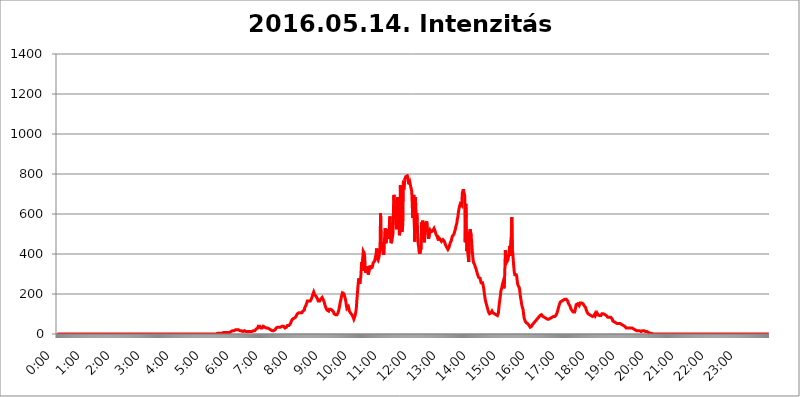
| Category | 2016.05.14. Intenzitás [W/m^2] |
|---|---|
| 0.0 | 0 |
| 0.0006944444444444445 | 0 |
| 0.001388888888888889 | 0 |
| 0.0020833333333333333 | 0 |
| 0.002777777777777778 | 0 |
| 0.003472222222222222 | 0 |
| 0.004166666666666667 | 0 |
| 0.004861111111111111 | 0 |
| 0.005555555555555556 | 0 |
| 0.0062499999999999995 | 0 |
| 0.006944444444444444 | 0 |
| 0.007638888888888889 | 0 |
| 0.008333333333333333 | 0 |
| 0.009027777777777779 | 0 |
| 0.009722222222222222 | 0 |
| 0.010416666666666666 | 0 |
| 0.011111111111111112 | 0 |
| 0.011805555555555555 | 0 |
| 0.012499999999999999 | 0 |
| 0.013194444444444444 | 0 |
| 0.013888888888888888 | 0 |
| 0.014583333333333332 | 0 |
| 0.015277777777777777 | 0 |
| 0.015972222222222224 | 0 |
| 0.016666666666666666 | 0 |
| 0.017361111111111112 | 0 |
| 0.018055555555555557 | 0 |
| 0.01875 | 0 |
| 0.019444444444444445 | 0 |
| 0.02013888888888889 | 0 |
| 0.020833333333333332 | 0 |
| 0.02152777777777778 | 0 |
| 0.022222222222222223 | 0 |
| 0.02291666666666667 | 0 |
| 0.02361111111111111 | 0 |
| 0.024305555555555556 | 0 |
| 0.024999999999999998 | 0 |
| 0.025694444444444447 | 0 |
| 0.02638888888888889 | 0 |
| 0.027083333333333334 | 0 |
| 0.027777777777777776 | 0 |
| 0.02847222222222222 | 0 |
| 0.029166666666666664 | 0 |
| 0.029861111111111113 | 0 |
| 0.030555555555555555 | 0 |
| 0.03125 | 0 |
| 0.03194444444444445 | 0 |
| 0.03263888888888889 | 0 |
| 0.03333333333333333 | 0 |
| 0.034027777777777775 | 0 |
| 0.034722222222222224 | 0 |
| 0.035416666666666666 | 0 |
| 0.036111111111111115 | 0 |
| 0.03680555555555556 | 0 |
| 0.0375 | 0 |
| 0.03819444444444444 | 0 |
| 0.03888888888888889 | 0 |
| 0.03958333333333333 | 0 |
| 0.04027777777777778 | 0 |
| 0.04097222222222222 | 0 |
| 0.041666666666666664 | 0 |
| 0.042361111111111106 | 0 |
| 0.04305555555555556 | 0 |
| 0.043750000000000004 | 0 |
| 0.044444444444444446 | 0 |
| 0.04513888888888889 | 0 |
| 0.04583333333333334 | 0 |
| 0.04652777777777778 | 0 |
| 0.04722222222222222 | 0 |
| 0.04791666666666666 | 0 |
| 0.04861111111111111 | 0 |
| 0.049305555555555554 | 0 |
| 0.049999999999999996 | 0 |
| 0.05069444444444445 | 0 |
| 0.051388888888888894 | 0 |
| 0.052083333333333336 | 0 |
| 0.05277777777777778 | 0 |
| 0.05347222222222222 | 0 |
| 0.05416666666666667 | 0 |
| 0.05486111111111111 | 0 |
| 0.05555555555555555 | 0 |
| 0.05625 | 0 |
| 0.05694444444444444 | 0 |
| 0.057638888888888885 | 0 |
| 0.05833333333333333 | 0 |
| 0.05902777777777778 | 0 |
| 0.059722222222222225 | 0 |
| 0.06041666666666667 | 0 |
| 0.061111111111111116 | 0 |
| 0.06180555555555556 | 0 |
| 0.0625 | 0 |
| 0.06319444444444444 | 0 |
| 0.06388888888888888 | 0 |
| 0.06458333333333334 | 0 |
| 0.06527777777777778 | 0 |
| 0.06597222222222222 | 0 |
| 0.06666666666666667 | 0 |
| 0.06736111111111111 | 0 |
| 0.06805555555555555 | 0 |
| 0.06874999999999999 | 0 |
| 0.06944444444444443 | 0 |
| 0.07013888888888889 | 0 |
| 0.07083333333333333 | 0 |
| 0.07152777777777779 | 0 |
| 0.07222222222222223 | 0 |
| 0.07291666666666667 | 0 |
| 0.07361111111111111 | 0 |
| 0.07430555555555556 | 0 |
| 0.075 | 0 |
| 0.07569444444444444 | 0 |
| 0.0763888888888889 | 0 |
| 0.07708333333333334 | 0 |
| 0.07777777777777778 | 0 |
| 0.07847222222222222 | 0 |
| 0.07916666666666666 | 0 |
| 0.0798611111111111 | 0 |
| 0.08055555555555556 | 0 |
| 0.08125 | 0 |
| 0.08194444444444444 | 0 |
| 0.08263888888888889 | 0 |
| 0.08333333333333333 | 0 |
| 0.08402777777777777 | 0 |
| 0.08472222222222221 | 0 |
| 0.08541666666666665 | 0 |
| 0.08611111111111112 | 0 |
| 0.08680555555555557 | 0 |
| 0.08750000000000001 | 0 |
| 0.08819444444444445 | 0 |
| 0.08888888888888889 | 0 |
| 0.08958333333333333 | 0 |
| 0.09027777777777778 | 0 |
| 0.09097222222222222 | 0 |
| 0.09166666666666667 | 0 |
| 0.09236111111111112 | 0 |
| 0.09305555555555556 | 0 |
| 0.09375 | 0 |
| 0.09444444444444444 | 0 |
| 0.09513888888888888 | 0 |
| 0.09583333333333333 | 0 |
| 0.09652777777777777 | 0 |
| 0.09722222222222222 | 0 |
| 0.09791666666666667 | 0 |
| 0.09861111111111111 | 0 |
| 0.09930555555555555 | 0 |
| 0.09999999999999999 | 0 |
| 0.10069444444444443 | 0 |
| 0.1013888888888889 | 0 |
| 0.10208333333333335 | 0 |
| 0.10277777777777779 | 0 |
| 0.10347222222222223 | 0 |
| 0.10416666666666667 | 0 |
| 0.10486111111111111 | 0 |
| 0.10555555555555556 | 0 |
| 0.10625 | 0 |
| 0.10694444444444444 | 0 |
| 0.1076388888888889 | 0 |
| 0.10833333333333334 | 0 |
| 0.10902777777777778 | 0 |
| 0.10972222222222222 | 0 |
| 0.1111111111111111 | 0 |
| 0.11180555555555556 | 0 |
| 0.11180555555555556 | 0 |
| 0.1125 | 0 |
| 0.11319444444444444 | 0 |
| 0.11388888888888889 | 0 |
| 0.11458333333333333 | 0 |
| 0.11527777777777777 | 0 |
| 0.11597222222222221 | 0 |
| 0.11666666666666665 | 0 |
| 0.1173611111111111 | 0 |
| 0.11805555555555557 | 0 |
| 0.11944444444444445 | 0 |
| 0.12013888888888889 | 0 |
| 0.12083333333333333 | 0 |
| 0.12152777777777778 | 0 |
| 0.12222222222222223 | 0 |
| 0.12291666666666667 | 0 |
| 0.12291666666666667 | 0 |
| 0.12361111111111112 | 0 |
| 0.12430555555555556 | 0 |
| 0.125 | 0 |
| 0.12569444444444444 | 0 |
| 0.12638888888888888 | 0 |
| 0.12708333333333333 | 0 |
| 0.16875 | 0 |
| 0.12847222222222224 | 0 |
| 0.12916666666666668 | 0 |
| 0.12986111111111112 | 0 |
| 0.13055555555555556 | 0 |
| 0.13125 | 0 |
| 0.13194444444444445 | 0 |
| 0.1326388888888889 | 0 |
| 0.13333333333333333 | 0 |
| 0.13402777777777777 | 0 |
| 0.13402777777777777 | 0 |
| 0.13472222222222222 | 0 |
| 0.13541666666666666 | 0 |
| 0.1361111111111111 | 0 |
| 0.13749999999999998 | 0 |
| 0.13819444444444443 | 0 |
| 0.1388888888888889 | 0 |
| 0.13958333333333334 | 0 |
| 0.14027777777777778 | 0 |
| 0.14097222222222222 | 0 |
| 0.14166666666666666 | 0 |
| 0.1423611111111111 | 0 |
| 0.14305555555555557 | 0 |
| 0.14375000000000002 | 0 |
| 0.14444444444444446 | 0 |
| 0.1451388888888889 | 0 |
| 0.1451388888888889 | 0 |
| 0.14652777777777778 | 0 |
| 0.14722222222222223 | 0 |
| 0.14791666666666667 | 0 |
| 0.1486111111111111 | 0 |
| 0.14930555555555555 | 0 |
| 0.15 | 0 |
| 0.15069444444444444 | 0 |
| 0.15138888888888888 | 0 |
| 0.15208333333333332 | 0 |
| 0.15277777777777776 | 0 |
| 0.15347222222222223 | 0 |
| 0.15416666666666667 | 0 |
| 0.15486111111111112 | 0 |
| 0.15555555555555556 | 0 |
| 0.15625 | 0 |
| 0.15694444444444444 | 0 |
| 0.15763888888888888 | 0 |
| 0.15833333333333333 | 0 |
| 0.15902777777777777 | 0 |
| 0.15972222222222224 | 0 |
| 0.16041666666666668 | 0 |
| 0.16111111111111112 | 0 |
| 0.16180555555555556 | 0 |
| 0.1625 | 0 |
| 0.16319444444444445 | 0 |
| 0.1638888888888889 | 0 |
| 0.16458333333333333 | 0 |
| 0.16527777777777777 | 0 |
| 0.16597222222222222 | 0 |
| 0.16666666666666666 | 0 |
| 0.1673611111111111 | 0 |
| 0.16805555555555554 | 0 |
| 0.16874999999999998 | 0 |
| 0.16944444444444443 | 0 |
| 0.17013888888888887 | 0 |
| 0.1708333333333333 | 0 |
| 0.17152777777777775 | 0 |
| 0.17222222222222225 | 0 |
| 0.1729166666666667 | 0 |
| 0.17361111111111113 | 0 |
| 0.17430555555555557 | 0 |
| 0.17500000000000002 | 0 |
| 0.17569444444444446 | 0 |
| 0.1763888888888889 | 0 |
| 0.17708333333333334 | 0 |
| 0.17777777777777778 | 0 |
| 0.17847222222222223 | 0 |
| 0.17916666666666667 | 0 |
| 0.1798611111111111 | 0 |
| 0.18055555555555555 | 0 |
| 0.18125 | 0 |
| 0.18194444444444444 | 0 |
| 0.1826388888888889 | 0 |
| 0.18333333333333335 | 0 |
| 0.1840277777777778 | 0 |
| 0.18472222222222223 | 0 |
| 0.18541666666666667 | 0 |
| 0.18611111111111112 | 0 |
| 0.18680555555555556 | 0 |
| 0.1875 | 0 |
| 0.18819444444444444 | 0 |
| 0.18888888888888888 | 0 |
| 0.18958333333333333 | 0 |
| 0.19027777777777777 | 0 |
| 0.1909722222222222 | 0 |
| 0.19166666666666665 | 0 |
| 0.19236111111111112 | 0 |
| 0.19305555555555554 | 0 |
| 0.19375 | 0 |
| 0.19444444444444445 | 0 |
| 0.1951388888888889 | 0 |
| 0.19583333333333333 | 0 |
| 0.19652777777777777 | 0 |
| 0.19722222222222222 | 0 |
| 0.19791666666666666 | 0 |
| 0.1986111111111111 | 0 |
| 0.19930555555555554 | 0 |
| 0.19999999999999998 | 0 |
| 0.20069444444444443 | 0 |
| 0.20138888888888887 | 0 |
| 0.2020833333333333 | 0 |
| 0.2027777777777778 | 0 |
| 0.2034722222222222 | 0 |
| 0.2041666666666667 | 0 |
| 0.20486111111111113 | 0 |
| 0.20555555555555557 | 0 |
| 0.20625000000000002 | 0 |
| 0.20694444444444446 | 0 |
| 0.2076388888888889 | 0 |
| 0.20833333333333334 | 0 |
| 0.20902777777777778 | 0 |
| 0.20972222222222223 | 0 |
| 0.21041666666666667 | 0 |
| 0.2111111111111111 | 0 |
| 0.21180555555555555 | 0 |
| 0.2125 | 0 |
| 0.21319444444444444 | 0 |
| 0.2138888888888889 | 0 |
| 0.21458333333333335 | 0 |
| 0.2152777777777778 | 0 |
| 0.21597222222222223 | 0 |
| 0.21666666666666667 | 0 |
| 0.21736111111111112 | 0 |
| 0.21805555555555556 | 0 |
| 0.21875 | 0 |
| 0.21944444444444444 | 0 |
| 0.22013888888888888 | 0 |
| 0.22083333333333333 | 0 |
| 0.22152777777777777 | 0 |
| 0.2222222222222222 | 0 |
| 0.22291666666666665 | 0 |
| 0.2236111111111111 | 0 |
| 0.22430555555555556 | 0 |
| 0.225 | 3.525 |
| 0.22569444444444445 | 3.525 |
| 0.2263888888888889 | 3.525 |
| 0.22708333333333333 | 3.525 |
| 0.22777777777777777 | 3.525 |
| 0.22847222222222222 | 3.525 |
| 0.22916666666666666 | 3.525 |
| 0.2298611111111111 | 3.525 |
| 0.23055555555555554 | 3.525 |
| 0.23124999999999998 | 3.525 |
| 0.23194444444444443 | 3.525 |
| 0.23263888888888887 | 7.887 |
| 0.2333333333333333 | 7.887 |
| 0.2340277777777778 | 7.887 |
| 0.2347222222222222 | 7.887 |
| 0.2354166666666667 | 7.887 |
| 0.23611111111111113 | 7.887 |
| 0.23680555555555557 | 7.887 |
| 0.23750000000000002 | 7.887 |
| 0.23819444444444446 | 7.887 |
| 0.2388888888888889 | 7.887 |
| 0.23958333333333334 | 7.887 |
| 0.24027777777777778 | 7.887 |
| 0.24097222222222223 | 7.887 |
| 0.24166666666666667 | 7.887 |
| 0.2423611111111111 | 7.887 |
| 0.24305555555555555 | 12.257 |
| 0.24375 | 12.257 |
| 0.24444444444444446 | 12.257 |
| 0.24513888888888888 | 12.257 |
| 0.24583333333333335 | 16.636 |
| 0.2465277777777778 | 16.636 |
| 0.24722222222222223 | 16.636 |
| 0.24791666666666667 | 16.636 |
| 0.24861111111111112 | 16.636 |
| 0.24930555555555556 | 16.636 |
| 0.25 | 21.024 |
| 0.25069444444444444 | 21.024 |
| 0.2513888888888889 | 21.024 |
| 0.2520833333333333 | 21.024 |
| 0.25277777777777777 | 21.024 |
| 0.2534722222222222 | 21.024 |
| 0.25416666666666665 | 21.024 |
| 0.2548611111111111 | 16.636 |
| 0.2555555555555556 | 16.636 |
| 0.25625000000000003 | 16.636 |
| 0.2569444444444445 | 16.636 |
| 0.2576388888888889 | 16.636 |
| 0.25833333333333336 | 16.636 |
| 0.2590277777777778 | 12.257 |
| 0.25972222222222224 | 12.257 |
| 0.2604166666666667 | 12.257 |
| 0.2611111111111111 | 12.257 |
| 0.26180555555555557 | 16.636 |
| 0.2625 | 16.636 |
| 0.26319444444444445 | 12.257 |
| 0.2638888888888889 | 12.257 |
| 0.26458333333333334 | 12.257 |
| 0.2652777777777778 | 12.257 |
| 0.2659722222222222 | 12.257 |
| 0.26666666666666666 | 12.257 |
| 0.2673611111111111 | 12.257 |
| 0.26805555555555555 | 12.257 |
| 0.26875 | 12.257 |
| 0.26944444444444443 | 12.257 |
| 0.2701388888888889 | 12.257 |
| 0.2708333333333333 | 12.257 |
| 0.27152777777777776 | 16.636 |
| 0.2722222222222222 | 12.257 |
| 0.27291666666666664 | 12.257 |
| 0.2736111111111111 | 16.636 |
| 0.2743055555555555 | 16.636 |
| 0.27499999999999997 | 16.636 |
| 0.27569444444444446 | 16.636 |
| 0.27638888888888885 | 16.636 |
| 0.27708333333333335 | 16.636 |
| 0.2777777777777778 | 21.024 |
| 0.27847222222222223 | 21.024 |
| 0.2791666666666667 | 25.419 |
| 0.2798611111111111 | 29.823 |
| 0.28055555555555556 | 29.823 |
| 0.28125 | 29.823 |
| 0.28194444444444444 | 38.653 |
| 0.2826388888888889 | 43.079 |
| 0.2833333333333333 | 43.079 |
| 0.28402777777777777 | 38.653 |
| 0.2847222222222222 | 38.653 |
| 0.28541666666666665 | 29.823 |
| 0.28611111111111115 | 29.823 |
| 0.28680555555555554 | 29.823 |
| 0.28750000000000003 | 29.823 |
| 0.2881944444444445 | 34.234 |
| 0.2888888888888889 | 38.653 |
| 0.28958333333333336 | 38.653 |
| 0.2902777777777778 | 38.653 |
| 0.29097222222222224 | 34.234 |
| 0.2916666666666667 | 29.823 |
| 0.2923611111111111 | 29.823 |
| 0.29305555555555557 | 29.823 |
| 0.29375 | 34.234 |
| 0.29444444444444445 | 29.823 |
| 0.2951388888888889 | 29.823 |
| 0.29583333333333334 | 25.419 |
| 0.2965277777777778 | 25.419 |
| 0.2972222222222222 | 25.419 |
| 0.29791666666666666 | 25.419 |
| 0.2986111111111111 | 21.024 |
| 0.29930555555555555 | 21.024 |
| 0.3 | 21.024 |
| 0.30069444444444443 | 21.024 |
| 0.3013888888888889 | 16.636 |
| 0.3020833333333333 | 16.636 |
| 0.30277777777777776 | 16.636 |
| 0.3034722222222222 | 16.636 |
| 0.30416666666666664 | 16.636 |
| 0.3048611111111111 | 21.024 |
| 0.3055555555555555 | 21.024 |
| 0.30624999999999997 | 25.419 |
| 0.3069444444444444 | 29.823 |
| 0.3076388888888889 | 29.823 |
| 0.30833333333333335 | 29.823 |
| 0.3090277777777778 | 34.234 |
| 0.30972222222222223 | 34.234 |
| 0.3104166666666667 | 34.234 |
| 0.3111111111111111 | 34.234 |
| 0.31180555555555556 | 29.823 |
| 0.3125 | 29.823 |
| 0.31319444444444444 | 34.234 |
| 0.3138888888888889 | 34.234 |
| 0.3145833333333333 | 34.234 |
| 0.31527777777777777 | 38.653 |
| 0.3159722222222222 | 34.234 |
| 0.31666666666666665 | 38.653 |
| 0.31736111111111115 | 38.653 |
| 0.31805555555555554 | 38.653 |
| 0.31875000000000003 | 34.234 |
| 0.3194444444444445 | 29.823 |
| 0.3201388888888889 | 29.823 |
| 0.32083333333333336 | 34.234 |
| 0.3215277777777778 | 34.234 |
| 0.32222222222222224 | 38.653 |
| 0.3229166666666667 | 43.079 |
| 0.3236111111111111 | 43.079 |
| 0.32430555555555557 | 43.079 |
| 0.325 | 43.079 |
| 0.32569444444444445 | 47.511 |
| 0.3263888888888889 | 47.511 |
| 0.32708333333333334 | 51.951 |
| 0.3277777777777778 | 56.398 |
| 0.3284722222222222 | 65.31 |
| 0.32916666666666666 | 69.775 |
| 0.3298611111111111 | 74.246 |
| 0.33055555555555555 | 78.722 |
| 0.33125 | 78.722 |
| 0.33194444444444443 | 78.722 |
| 0.3326388888888889 | 83.205 |
| 0.3333333333333333 | 83.205 |
| 0.3340277777777778 | 83.205 |
| 0.3347222222222222 | 87.692 |
| 0.3354166666666667 | 92.184 |
| 0.3361111111111111 | 96.682 |
| 0.3368055555555556 | 101.184 |
| 0.33749999999999997 | 101.184 |
| 0.33819444444444446 | 105.69 |
| 0.33888888888888885 | 105.69 |
| 0.33958333333333335 | 110.201 |
| 0.34027777777777773 | 110.201 |
| 0.34097222222222223 | 105.69 |
| 0.3416666666666666 | 105.69 |
| 0.3423611111111111 | 105.69 |
| 0.3430555555555555 | 105.69 |
| 0.34375 | 110.201 |
| 0.3444444444444445 | 114.716 |
| 0.3451388888888889 | 114.716 |
| 0.3458333333333334 | 119.235 |
| 0.34652777777777777 | 119.235 |
| 0.34722222222222227 | 132.814 |
| 0.34791666666666665 | 132.814 |
| 0.34861111111111115 | 141.884 |
| 0.34930555555555554 | 146.423 |
| 0.35000000000000003 | 155.509 |
| 0.3506944444444444 | 164.605 |
| 0.3513888888888889 | 164.605 |
| 0.3520833333333333 | 164.605 |
| 0.3527777777777778 | 164.605 |
| 0.3534722222222222 | 164.605 |
| 0.3541666666666667 | 164.605 |
| 0.3548611111111111 | 164.605 |
| 0.35555555555555557 | 164.605 |
| 0.35625 | 173.709 |
| 0.35694444444444445 | 178.264 |
| 0.3576388888888889 | 187.378 |
| 0.35833333333333334 | 196.497 |
| 0.3590277777777778 | 201.058 |
| 0.3597222222222222 | 210.182 |
| 0.36041666666666666 | 210.182 |
| 0.3611111111111111 | 196.497 |
| 0.36180555555555555 | 196.497 |
| 0.3625 | 191.937 |
| 0.36319444444444443 | 187.378 |
| 0.3638888888888889 | 187.378 |
| 0.3645833333333333 | 182.82 |
| 0.3652777777777778 | 173.709 |
| 0.3659722222222222 | 164.605 |
| 0.3666666666666667 | 160.056 |
| 0.3673611111111111 | 160.056 |
| 0.3680555555555556 | 164.605 |
| 0.36874999999999997 | 169.156 |
| 0.36944444444444446 | 173.709 |
| 0.37013888888888885 | 178.264 |
| 0.37083333333333335 | 178.264 |
| 0.37152777777777773 | 182.82 |
| 0.37222222222222223 | 178.264 |
| 0.3729166666666666 | 173.709 |
| 0.3736111111111111 | 169.156 |
| 0.3743055555555555 | 160.056 |
| 0.375 | 150.964 |
| 0.3756944444444445 | 141.884 |
| 0.3763888888888889 | 137.347 |
| 0.3770833333333334 | 128.284 |
| 0.37777777777777777 | 123.758 |
| 0.37847222222222227 | 119.235 |
| 0.37916666666666665 | 119.235 |
| 0.37986111111111115 | 114.716 |
| 0.38055555555555554 | 114.716 |
| 0.38125000000000003 | 123.758 |
| 0.3819444444444444 | 128.284 |
| 0.3826388888888889 | 128.284 |
| 0.3833333333333333 | 123.758 |
| 0.3840277777777778 | 119.235 |
| 0.3847222222222222 | 119.235 |
| 0.3854166666666667 | 119.235 |
| 0.3861111111111111 | 119.235 |
| 0.38680555555555557 | 114.716 |
| 0.3875 | 110.201 |
| 0.38819444444444445 | 101.184 |
| 0.3888888888888889 | 101.184 |
| 0.38958333333333334 | 101.184 |
| 0.3902777777777778 | 96.682 |
| 0.3909722222222222 | 96.682 |
| 0.39166666666666666 | 96.682 |
| 0.3923611111111111 | 96.682 |
| 0.39305555555555555 | 101.184 |
| 0.39375 | 105.69 |
| 0.39444444444444443 | 114.716 |
| 0.3951388888888889 | 123.758 |
| 0.3958333333333333 | 137.347 |
| 0.3965277777777778 | 150.964 |
| 0.3972222222222222 | 164.605 |
| 0.3979166666666667 | 173.709 |
| 0.3986111111111111 | 187.378 |
| 0.3993055555555556 | 196.497 |
| 0.39999999999999997 | 205.62 |
| 0.40069444444444446 | 210.182 |
| 0.40138888888888885 | 210.182 |
| 0.40208333333333335 | 201.058 |
| 0.40277777777777773 | 191.937 |
| 0.40347222222222223 | 182.82 |
| 0.4041666666666666 | 173.709 |
| 0.4048611111111111 | 160.056 |
| 0.4055555555555555 | 141.884 |
| 0.40625 | 128.284 |
| 0.4069444444444445 | 128.284 |
| 0.4076388888888889 | 132.814 |
| 0.4083333333333334 | 137.347 |
| 0.40902777777777777 | 128.284 |
| 0.40972222222222227 | 114.716 |
| 0.41041666666666665 | 110.201 |
| 0.41111111111111115 | 105.69 |
| 0.41180555555555554 | 105.69 |
| 0.41250000000000003 | 101.184 |
| 0.4131944444444444 | 96.682 |
| 0.4138888888888889 | 92.184 |
| 0.4145833333333333 | 87.692 |
| 0.4152777777777778 | 83.205 |
| 0.4159722222222222 | 74.246 |
| 0.4166666666666667 | 78.722 |
| 0.4173611111111111 | 87.692 |
| 0.41805555555555557 | 96.682 |
| 0.41875 | 110.201 |
| 0.41944444444444445 | 128.284 |
| 0.4201388888888889 | 164.605 |
| 0.42083333333333334 | 196.497 |
| 0.4215277777777778 | 228.436 |
| 0.4222222222222222 | 255.813 |
| 0.42291666666666666 | 278.603 |
| 0.4236111111111111 | 269.49 |
| 0.42430555555555555 | 251.251 |
| 0.425 | 274.047 |
| 0.42569444444444443 | 283.156 |
| 0.4263888888888889 | 328.584 |
| 0.4270833333333333 | 360.221 |
| 0.4277777777777778 | 314.98 |
| 0.4284722222222222 | 378.224 |
| 0.4291666666666667 | 414.035 |
| 0.4298611111111111 | 418.492 |
| 0.4305555555555556 | 405.108 |
| 0.43124999999999997 | 382.715 |
| 0.43194444444444446 | 328.584 |
| 0.43263888888888885 | 305.898 |
| 0.43333333333333335 | 310.44 |
| 0.43402777777777773 | 305.898 |
| 0.43472222222222223 | 337.639 |
| 0.4354166666666666 | 319.517 |
| 0.4361111111111111 | 296.808 |
| 0.4368055555555555 | 305.898 |
| 0.4375 | 314.98 |
| 0.4381944444444445 | 342.162 |
| 0.4388888888888889 | 342.162 |
| 0.4395833333333334 | 328.584 |
| 0.44027777777777777 | 324.052 |
| 0.44097222222222227 | 328.584 |
| 0.44166666666666665 | 333.113 |
| 0.44236111111111115 | 342.162 |
| 0.44305555555555554 | 355.712 |
| 0.44375000000000003 | 351.198 |
| 0.4444444444444444 | 355.712 |
| 0.4451388888888889 | 364.728 |
| 0.4458333333333333 | 378.224 |
| 0.4465277777777778 | 387.202 |
| 0.4472222222222222 | 400.638 |
| 0.4479166666666667 | 427.39 |
| 0.4486111111111111 | 378.224 |
| 0.44930555555555557 | 373.729 |
| 0.45 | 369.23 |
| 0.45069444444444445 | 369.23 |
| 0.4513888888888889 | 387.202 |
| 0.45208333333333334 | 414.035 |
| 0.4527777777777778 | 440.702 |
| 0.4534722222222222 | 604.864 |
| 0.45416666666666666 | 467.187 |
| 0.4548611111111111 | 462.786 |
| 0.45555555555555555 | 440.702 |
| 0.45625 | 418.492 |
| 0.45694444444444443 | 405.108 |
| 0.4576388888888889 | 396.164 |
| 0.4583333333333333 | 409.574 |
| 0.4590277777777778 | 471.582 |
| 0.4597222222222222 | 528.2 |
| 0.4604166666666667 | 519.555 |
| 0.4611111111111111 | 453.968 |
| 0.4618055555555556 | 458.38 |
| 0.46249999999999997 | 523.88 |
| 0.46319444444444446 | 519.555 |
| 0.46388888888888885 | 475.972 |
| 0.46458333333333335 | 471.582 |
| 0.46527777777777773 | 489.108 |
| 0.46597222222222223 | 558.261 |
| 0.4666666666666666 | 588.009 |
| 0.4673611111111111 | 493.475 |
| 0.4680555555555555 | 453.968 |
| 0.46875 | 458.38 |
| 0.4694444444444445 | 467.187 |
| 0.4701388888888889 | 471.582 |
| 0.4708333333333334 | 502.192 |
| 0.47152777777777777 | 617.436 |
| 0.47222222222222227 | 695.666 |
| 0.47291666666666665 | 629.948 |
| 0.47361111111111115 | 600.661 |
| 0.47430555555555554 | 600.661 |
| 0.47500000000000003 | 562.53 |
| 0.4756944444444444 | 523.88 |
| 0.4763888888888889 | 617.436 |
| 0.4770833333333333 | 683.473 |
| 0.4777777777777778 | 638.256 |
| 0.4784722222222222 | 617.436 |
| 0.4791666666666667 | 562.53 |
| 0.4798611111111111 | 493.475 |
| 0.48055555555555557 | 510.885 |
| 0.48125 | 743.859 |
| 0.48194444444444445 | 583.779 |
| 0.4826388888888889 | 541.121 |
| 0.48333333333333334 | 510.885 |
| 0.4840277777777778 | 519.555 |
| 0.4847222222222222 | 553.986 |
| 0.48541666666666666 | 747.834 |
| 0.4861111111111111 | 747.834 |
| 0.48680555555555555 | 739.877 |
| 0.4875 | 775.492 |
| 0.48819444444444443 | 779.42 |
| 0.4888888888888889 | 787.258 |
| 0.4895833333333333 | 783.342 |
| 0.4902777777777778 | 791.169 |
| 0.4909722222222222 | 791.169 |
| 0.4916666666666667 | 783.342 |
| 0.4923611111111111 | 767.62 |
| 0.4930555555555556 | 747.834 |
| 0.49374999999999997 | 743.859 |
| 0.49444444444444446 | 759.723 |
| 0.49513888888888885 | 763.674 |
| 0.49583333333333335 | 755.766 |
| 0.49652777777777773 | 723.889 |
| 0.49722222222222223 | 711.832 |
| 0.4979166666666666 | 707.8 |
| 0.4986111111111111 | 579.542 |
| 0.4993055555555555 | 634.105 |
| 0.5 | 695.666 |
| 0.5006944444444444 | 695.666 |
| 0.5013888888888889 | 462.786 |
| 0.5020833333333333 | 683.473 |
| 0.5027777777777778 | 646.537 |
| 0.5034722222222222 | 571.049 |
| 0.5041666666666667 | 604.864 |
| 0.5048611111111111 | 571.049 |
| 0.5055555555555555 | 489.108 |
| 0.50625 | 449.551 |
| 0.5069444444444444 | 436.27 |
| 0.5076388888888889 | 409.574 |
| 0.5083333333333333 | 400.638 |
| 0.5090277777777777 | 400.638 |
| 0.5097222222222222 | 405.108 |
| 0.5104166666666666 | 431.833 |
| 0.5111111111111112 | 558.261 |
| 0.5118055555555555 | 471.582 |
| 0.5125000000000001 | 566.793 |
| 0.5131944444444444 | 489.108 |
| 0.513888888888889 | 480.356 |
| 0.5145833333333333 | 458.38 |
| 0.5152777777777778 | 475.972 |
| 0.5159722222222222 | 493.475 |
| 0.5166666666666667 | 558.261 |
| 0.517361111111111 | 536.82 |
| 0.5180555555555556 | 562.53 |
| 0.5187499999999999 | 545.416 |
| 0.5194444444444445 | 510.885 |
| 0.5201388888888888 | 523.88 |
| 0.5208333333333334 | 475.972 |
| 0.5215277777777778 | 480.356 |
| 0.5222222222222223 | 510.885 |
| 0.5229166666666667 | 519.555 |
| 0.5236111111111111 | 519.555 |
| 0.5243055555555556 | 510.885 |
| 0.525 | 510.885 |
| 0.5256944444444445 | 510.885 |
| 0.5263888888888889 | 515.223 |
| 0.5270833333333333 | 519.555 |
| 0.5277777777777778 | 519.555 |
| 0.5284722222222222 | 528.2 |
| 0.5291666666666667 | 528.2 |
| 0.5298611111111111 | 515.223 |
| 0.5305555555555556 | 506.542 |
| 0.53125 | 497.836 |
| 0.5319444444444444 | 502.192 |
| 0.5326388888888889 | 489.108 |
| 0.5333333333333333 | 489.108 |
| 0.5340277777777778 | 489.108 |
| 0.5347222222222222 | 467.187 |
| 0.5354166666666667 | 480.356 |
| 0.5361111111111111 | 484.735 |
| 0.5368055555555555 | 480.356 |
| 0.5375 | 471.582 |
| 0.5381944444444444 | 467.187 |
| 0.5388888888888889 | 462.786 |
| 0.5395833333333333 | 462.786 |
| 0.5402777777777777 | 467.187 |
| 0.5409722222222222 | 471.582 |
| 0.5416666666666666 | 471.582 |
| 0.5423611111111112 | 467.187 |
| 0.5430555555555555 | 462.786 |
| 0.5437500000000001 | 453.968 |
| 0.5444444444444444 | 449.551 |
| 0.545138888888889 | 440.702 |
| 0.5458333333333333 | 436.27 |
| 0.5465277777777778 | 431.833 |
| 0.5472222222222222 | 427.39 |
| 0.5479166666666667 | 422.943 |
| 0.548611111111111 | 427.39 |
| 0.5493055555555556 | 431.833 |
| 0.5499999999999999 | 440.702 |
| 0.5506944444444445 | 449.551 |
| 0.5513888888888888 | 458.38 |
| 0.5520833333333334 | 462.786 |
| 0.5527777777777778 | 467.187 |
| 0.5534722222222223 | 480.356 |
| 0.5541666666666667 | 489.108 |
| 0.5548611111111111 | 489.108 |
| 0.5555555555555556 | 493.475 |
| 0.55625 | 497.836 |
| 0.5569444444444445 | 506.542 |
| 0.5576388888888889 | 510.885 |
| 0.5583333333333333 | 523.88 |
| 0.5590277777777778 | 536.82 |
| 0.5597222222222222 | 545.416 |
| 0.5604166666666667 | 553.986 |
| 0.5611111111111111 | 575.299 |
| 0.5618055555555556 | 583.779 |
| 0.5625 | 604.864 |
| 0.5631944444444444 | 621.613 |
| 0.5638888888888889 | 634.105 |
| 0.5645833333333333 | 638.256 |
| 0.5652777777777778 | 650.667 |
| 0.5659722222222222 | 654.791 |
| 0.5666666666666667 | 650.667 |
| 0.5673611111111111 | 642.4 |
| 0.5680555555555555 | 703.762 |
| 0.56875 | 711.832 |
| 0.5694444444444444 | 723.889 |
| 0.5701388888888889 | 711.832 |
| 0.5708333333333333 | 711.832 |
| 0.5715277777777777 | 691.608 |
| 0.5722222222222222 | 458.38 |
| 0.5729166666666666 | 650.667 |
| 0.5736111111111112 | 583.779 |
| 0.5743055555555555 | 414.035 |
| 0.5750000000000001 | 431.833 |
| 0.5756944444444444 | 471.582 |
| 0.576388888888889 | 387.202 |
| 0.5770833333333333 | 360.221 |
| 0.5777777777777778 | 480.356 |
| 0.5784722222222222 | 515.223 |
| 0.5791666666666667 | 523.88 |
| 0.579861111111111 | 519.555 |
| 0.5805555555555556 | 489.108 |
| 0.5812499999999999 | 458.38 |
| 0.5819444444444445 | 422.943 |
| 0.5826388888888888 | 391.685 |
| 0.5833333333333334 | 369.23 |
| 0.5840277777777778 | 355.712 |
| 0.5847222222222223 | 351.198 |
| 0.5854166666666667 | 346.682 |
| 0.5861111111111111 | 337.639 |
| 0.5868055555555556 | 333.113 |
| 0.5875 | 324.052 |
| 0.5881944444444445 | 314.98 |
| 0.5888888888888889 | 305.898 |
| 0.5895833333333333 | 296.808 |
| 0.5902777777777778 | 292.259 |
| 0.5909722222222222 | 283.156 |
| 0.5916666666666667 | 278.603 |
| 0.5923611111111111 | 283.156 |
| 0.5930555555555556 | 278.603 |
| 0.59375 | 274.047 |
| 0.5944444444444444 | 255.813 |
| 0.5951388888888889 | 251.251 |
| 0.5958333333333333 | 255.813 |
| 0.5965277777777778 | 255.813 |
| 0.5972222222222222 | 251.251 |
| 0.5979166666666667 | 233 |
| 0.5986111111111111 | 214.746 |
| 0.5993055555555555 | 196.497 |
| 0.6 | 178.264 |
| 0.6006944444444444 | 164.605 |
| 0.6013888888888889 | 155.509 |
| 0.6020833333333333 | 146.423 |
| 0.6027777777777777 | 137.347 |
| 0.6034722222222222 | 128.284 |
| 0.6041666666666666 | 119.235 |
| 0.6048611111111112 | 110.201 |
| 0.6055555555555555 | 105.69 |
| 0.6062500000000001 | 101.184 |
| 0.6069444444444444 | 101.184 |
| 0.607638888888889 | 101.184 |
| 0.6083333333333333 | 105.69 |
| 0.6090277777777778 | 110.201 |
| 0.6097222222222222 | 114.716 |
| 0.6104166666666667 | 110.201 |
| 0.611111111111111 | 105.69 |
| 0.6118055555555556 | 101.184 |
| 0.6124999999999999 | 101.184 |
| 0.6131944444444445 | 101.184 |
| 0.6138888888888888 | 101.184 |
| 0.6145833333333334 | 96.682 |
| 0.6152777777777778 | 96.682 |
| 0.6159722222222223 | 92.184 |
| 0.6166666666666667 | 92.184 |
| 0.6173611111111111 | 92.184 |
| 0.6180555555555556 | 96.682 |
| 0.61875 | 105.69 |
| 0.6194444444444445 | 132.814 |
| 0.6201388888888889 | 155.509 |
| 0.6208333333333333 | 173.709 |
| 0.6215277777777778 | 191.937 |
| 0.6222222222222222 | 214.746 |
| 0.6229166666666667 | 223.873 |
| 0.6236111111111111 | 233 |
| 0.6243055555555556 | 246.689 |
| 0.625 | 255.813 |
| 0.6256944444444444 | 246.689 |
| 0.6263888888888889 | 228.436 |
| 0.6270833333333333 | 246.689 |
| 0.6277777777777778 | 324.052 |
| 0.6284722222222222 | 418.492 |
| 0.6291666666666667 | 382.715 |
| 0.6298611111111111 | 378.224 |
| 0.6305555555555555 | 360.221 |
| 0.63125 | 360.221 |
| 0.6319444444444444 | 369.23 |
| 0.6326388888888889 | 382.715 |
| 0.6333333333333333 | 378.224 |
| 0.6340277777777777 | 387.202 |
| 0.6347222222222222 | 440.702 |
| 0.6354166666666666 | 391.685 |
| 0.6361111111111112 | 391.685 |
| 0.6368055555555555 | 484.735 |
| 0.6375000000000001 | 583.779 |
| 0.6381944444444444 | 422.943 |
| 0.638888888888889 | 405.108 |
| 0.6395833333333333 | 369.23 |
| 0.6402777777777778 | 337.639 |
| 0.6409722222222222 | 310.44 |
| 0.6416666666666667 | 296.808 |
| 0.642361111111111 | 292.259 |
| 0.6430555555555556 | 296.808 |
| 0.6437499999999999 | 296.808 |
| 0.6444444444444445 | 287.709 |
| 0.6451388888888888 | 264.932 |
| 0.6458333333333334 | 246.689 |
| 0.6465277777777778 | 246.689 |
| 0.6472222222222223 | 242.127 |
| 0.6479166666666667 | 233 |
| 0.6486111111111111 | 219.309 |
| 0.6493055555555556 | 196.497 |
| 0.65 | 178.264 |
| 0.6506944444444445 | 164.605 |
| 0.6513888888888889 | 146.423 |
| 0.6520833333333333 | 137.347 |
| 0.6527777777777778 | 128.284 |
| 0.6534722222222222 | 119.235 |
| 0.6541666666666667 | 96.682 |
| 0.6548611111111111 | 78.722 |
| 0.6555555555555556 | 74.246 |
| 0.65625 | 65.31 |
| 0.6569444444444444 | 65.31 |
| 0.6576388888888889 | 56.398 |
| 0.6583333333333333 | 56.398 |
| 0.6590277777777778 | 56.398 |
| 0.6597222222222222 | 51.951 |
| 0.6604166666666667 | 51.951 |
| 0.6611111111111111 | 47.511 |
| 0.6618055555555555 | 43.079 |
| 0.6625 | 38.653 |
| 0.6631944444444444 | 34.234 |
| 0.6638888888888889 | 34.234 |
| 0.6645833333333333 | 34.234 |
| 0.6652777777777777 | 38.653 |
| 0.6659722222222222 | 43.079 |
| 0.6666666666666666 | 47.511 |
| 0.6673611111111111 | 51.951 |
| 0.6680555555555556 | 51.951 |
| 0.6687500000000001 | 56.398 |
| 0.6694444444444444 | 56.398 |
| 0.6701388888888888 | 60.85 |
| 0.6708333333333334 | 65.31 |
| 0.6715277777777778 | 65.31 |
| 0.6722222222222222 | 69.775 |
| 0.6729166666666666 | 74.246 |
| 0.6736111111111112 | 74.246 |
| 0.6743055555555556 | 78.722 |
| 0.6749999999999999 | 83.205 |
| 0.6756944444444444 | 83.205 |
| 0.6763888888888889 | 87.692 |
| 0.6770833333333334 | 92.184 |
| 0.6777777777777777 | 92.184 |
| 0.6784722222222223 | 96.682 |
| 0.6791666666666667 | 96.682 |
| 0.6798611111111111 | 92.184 |
| 0.6805555555555555 | 92.184 |
| 0.68125 | 87.692 |
| 0.6819444444444445 | 87.692 |
| 0.6826388888888889 | 83.205 |
| 0.6833333333333332 | 83.205 |
| 0.6840277777777778 | 83.205 |
| 0.6847222222222222 | 78.722 |
| 0.6854166666666667 | 78.722 |
| 0.686111111111111 | 78.722 |
| 0.6868055555555556 | 78.722 |
| 0.6875 | 74.246 |
| 0.6881944444444444 | 74.246 |
| 0.688888888888889 | 74.246 |
| 0.6895833333333333 | 74.246 |
| 0.6902777777777778 | 74.246 |
| 0.6909722222222222 | 74.246 |
| 0.6916666666666668 | 78.722 |
| 0.6923611111111111 | 78.722 |
| 0.6930555555555555 | 78.722 |
| 0.69375 | 83.205 |
| 0.6944444444444445 | 83.205 |
| 0.6951388888888889 | 83.205 |
| 0.6958333333333333 | 87.692 |
| 0.6965277777777777 | 87.692 |
| 0.6972222222222223 | 87.692 |
| 0.6979166666666666 | 87.692 |
| 0.6986111111111111 | 92.184 |
| 0.6993055555555556 | 92.184 |
| 0.7000000000000001 | 96.682 |
| 0.7006944444444444 | 101.184 |
| 0.7013888888888888 | 110.201 |
| 0.7020833333333334 | 119.235 |
| 0.7027777777777778 | 128.284 |
| 0.7034722222222222 | 137.347 |
| 0.7041666666666666 | 146.423 |
| 0.7048611111111112 | 150.964 |
| 0.7055555555555556 | 160.056 |
| 0.7062499999999999 | 164.605 |
| 0.7069444444444444 | 164.605 |
| 0.7076388888888889 | 164.605 |
| 0.7083333333333334 | 164.605 |
| 0.7090277777777777 | 164.605 |
| 0.7097222222222223 | 169.156 |
| 0.7104166666666667 | 169.156 |
| 0.7111111111111111 | 169.156 |
| 0.7118055555555555 | 173.709 |
| 0.7125 | 173.709 |
| 0.7131944444444445 | 173.709 |
| 0.7138888888888889 | 173.709 |
| 0.7145833333333332 | 169.156 |
| 0.7152777777777778 | 169.156 |
| 0.7159722222222222 | 164.605 |
| 0.7166666666666667 | 155.509 |
| 0.717361111111111 | 155.509 |
| 0.7180555555555556 | 146.423 |
| 0.71875 | 141.884 |
| 0.7194444444444444 | 137.347 |
| 0.720138888888889 | 128.284 |
| 0.7208333333333333 | 123.758 |
| 0.7215277777777778 | 119.235 |
| 0.7222222222222222 | 114.716 |
| 0.7229166666666668 | 114.716 |
| 0.7236111111111111 | 110.201 |
| 0.7243055555555555 | 110.201 |
| 0.725 | 110.201 |
| 0.7256944444444445 | 110.201 |
| 0.7263888888888889 | 119.235 |
| 0.7270833333333333 | 132.814 |
| 0.7277777777777777 | 146.423 |
| 0.7284722222222223 | 146.423 |
| 0.7291666666666666 | 146.423 |
| 0.7298611111111111 | 150.964 |
| 0.7305555555555556 | 146.423 |
| 0.7312500000000001 | 146.423 |
| 0.7319444444444444 | 141.884 |
| 0.7326388888888888 | 141.884 |
| 0.7333333333333334 | 155.509 |
| 0.7340277777777778 | 155.509 |
| 0.7347222222222222 | 160.056 |
| 0.7354166666666666 | 155.509 |
| 0.7361111111111112 | 155.509 |
| 0.7368055555555556 | 155.509 |
| 0.7374999999999999 | 150.964 |
| 0.7381944444444444 | 146.423 |
| 0.7388888888888889 | 141.884 |
| 0.7395833333333334 | 137.347 |
| 0.7402777777777777 | 137.347 |
| 0.7409722222222223 | 132.814 |
| 0.7416666666666667 | 123.758 |
| 0.7423611111111111 | 119.235 |
| 0.7430555555555555 | 110.201 |
| 0.74375 | 105.69 |
| 0.7444444444444445 | 101.184 |
| 0.7451388888888889 | 101.184 |
| 0.7458333333333332 | 96.682 |
| 0.7465277777777778 | 96.682 |
| 0.7472222222222222 | 92.184 |
| 0.7479166666666667 | 92.184 |
| 0.748611111111111 | 92.184 |
| 0.7493055555555556 | 92.184 |
| 0.75 | 92.184 |
| 0.7506944444444444 | 87.692 |
| 0.751388888888889 | 87.692 |
| 0.7520833333333333 | 92.184 |
| 0.7527777777777778 | 92.184 |
| 0.7534722222222222 | 96.682 |
| 0.7541666666666668 | 101.184 |
| 0.7548611111111111 | 92.184 |
| 0.7555555555555555 | 96.682 |
| 0.75625 | 92.184 |
| 0.7569444444444445 | 105.69 |
| 0.7576388888888889 | 110.201 |
| 0.7583333333333333 | 96.682 |
| 0.7590277777777777 | 96.682 |
| 0.7597222222222223 | 96.682 |
| 0.7604166666666666 | 92.184 |
| 0.7611111111111111 | 92.184 |
| 0.7618055555555556 | 96.682 |
| 0.7625000000000001 | 92.184 |
| 0.7631944444444444 | 92.184 |
| 0.7638888888888888 | 101.184 |
| 0.7645833333333334 | 105.69 |
| 0.7652777777777778 | 101.184 |
| 0.7659722222222222 | 101.184 |
| 0.7666666666666666 | 101.184 |
| 0.7673611111111112 | 96.682 |
| 0.7680555555555556 | 96.682 |
| 0.7687499999999999 | 92.184 |
| 0.7694444444444444 | 92.184 |
| 0.7701388888888889 | 92.184 |
| 0.7708333333333334 | 92.184 |
| 0.7715277777777777 | 87.692 |
| 0.7722222222222223 | 83.205 |
| 0.7729166666666667 | 83.205 |
| 0.7736111111111111 | 83.205 |
| 0.7743055555555555 | 83.205 |
| 0.775 | 87.692 |
| 0.7756944444444445 | 83.205 |
| 0.7763888888888889 | 83.205 |
| 0.7770833333333332 | 83.205 |
| 0.7777777777777778 | 78.722 |
| 0.7784722222222222 | 74.246 |
| 0.7791666666666667 | 65.31 |
| 0.779861111111111 | 60.85 |
| 0.7805555555555556 | 60.85 |
| 0.78125 | 60.85 |
| 0.7819444444444444 | 56.398 |
| 0.782638888888889 | 56.398 |
| 0.7833333333333333 | 56.398 |
| 0.7840277777777778 | 56.398 |
| 0.7847222222222222 | 56.398 |
| 0.7854166666666668 | 51.951 |
| 0.7861111111111111 | 51.951 |
| 0.7868055555555555 | 51.951 |
| 0.7875 | 51.951 |
| 0.7881944444444445 | 56.398 |
| 0.7888888888888889 | 51.951 |
| 0.7895833333333333 | 51.951 |
| 0.7902777777777777 | 47.511 |
| 0.7909722222222223 | 47.511 |
| 0.7916666666666666 | 47.511 |
| 0.7923611111111111 | 47.511 |
| 0.7930555555555556 | 43.079 |
| 0.7937500000000001 | 43.079 |
| 0.7944444444444444 | 38.653 |
| 0.7951388888888888 | 38.653 |
| 0.7958333333333334 | 38.653 |
| 0.7965277777777778 | 34.234 |
| 0.7972222222222222 | 34.234 |
| 0.7979166666666666 | 29.823 |
| 0.7986111111111112 | 29.823 |
| 0.7993055555555556 | 29.823 |
| 0.7999999999999999 | 29.823 |
| 0.8006944444444444 | 29.823 |
| 0.8013888888888889 | 29.823 |
| 0.8020833333333334 | 29.823 |
| 0.8027777777777777 | 34.234 |
| 0.8034722222222223 | 29.823 |
| 0.8041666666666667 | 29.823 |
| 0.8048611111111111 | 29.823 |
| 0.8055555555555555 | 29.823 |
| 0.80625 | 29.823 |
| 0.8069444444444445 | 25.419 |
| 0.8076388888888889 | 25.419 |
| 0.8083333333333332 | 25.419 |
| 0.8090277777777778 | 21.024 |
| 0.8097222222222222 | 21.024 |
| 0.8104166666666667 | 21.024 |
| 0.811111111111111 | 21.024 |
| 0.8118055555555556 | 21.024 |
| 0.8125 | 16.636 |
| 0.8131944444444444 | 16.636 |
| 0.813888888888889 | 16.636 |
| 0.8145833333333333 | 16.636 |
| 0.8152777777777778 | 16.636 |
| 0.8159722222222222 | 16.636 |
| 0.8166666666666668 | 16.636 |
| 0.8173611111111111 | 16.636 |
| 0.8180555555555555 | 16.636 |
| 0.81875 | 12.257 |
| 0.8194444444444445 | 16.636 |
| 0.8201388888888889 | 16.636 |
| 0.8208333333333333 | 16.636 |
| 0.8215277777777777 | 16.636 |
| 0.8222222222222223 | 16.636 |
| 0.8229166666666666 | 16.636 |
| 0.8236111111111111 | 16.636 |
| 0.8243055555555556 | 12.257 |
| 0.8250000000000001 | 12.257 |
| 0.8256944444444444 | 12.257 |
| 0.8263888888888888 | 12.257 |
| 0.8270833333333334 | 12.257 |
| 0.8277777777777778 | 7.887 |
| 0.8284722222222222 | 7.887 |
| 0.8291666666666666 | 7.887 |
| 0.8298611111111112 | 7.887 |
| 0.8305555555555556 | 3.525 |
| 0.8312499999999999 | 3.525 |
| 0.8319444444444444 | 3.525 |
| 0.8326388888888889 | 3.525 |
| 0.8333333333333334 | 3.525 |
| 0.8340277777777777 | 3.525 |
| 0.8347222222222223 | 0 |
| 0.8354166666666667 | 0 |
| 0.8361111111111111 | 0 |
| 0.8368055555555555 | 0 |
| 0.8375 | 0 |
| 0.8381944444444445 | 0 |
| 0.8388888888888889 | 0 |
| 0.8395833333333332 | 0 |
| 0.8402777777777778 | 0 |
| 0.8409722222222222 | 0 |
| 0.8416666666666667 | 0 |
| 0.842361111111111 | 0 |
| 0.8430555555555556 | 0 |
| 0.84375 | 0 |
| 0.8444444444444444 | 0 |
| 0.845138888888889 | 0 |
| 0.8458333333333333 | 0 |
| 0.8465277777777778 | 0 |
| 0.8472222222222222 | 0 |
| 0.8479166666666668 | 0 |
| 0.8486111111111111 | 0 |
| 0.8493055555555555 | 0 |
| 0.85 | 0 |
| 0.8506944444444445 | 0 |
| 0.8513888888888889 | 0 |
| 0.8520833333333333 | 0 |
| 0.8527777777777777 | 0 |
| 0.8534722222222223 | 0 |
| 0.8541666666666666 | 0 |
| 0.8548611111111111 | 0 |
| 0.8555555555555556 | 0 |
| 0.8562500000000001 | 0 |
| 0.8569444444444444 | 0 |
| 0.8576388888888888 | 0 |
| 0.8583333333333334 | 0 |
| 0.8590277777777778 | 0 |
| 0.8597222222222222 | 0 |
| 0.8604166666666666 | 0 |
| 0.8611111111111112 | 0 |
| 0.8618055555555556 | 0 |
| 0.8624999999999999 | 0 |
| 0.8631944444444444 | 0 |
| 0.8638888888888889 | 0 |
| 0.8645833333333334 | 0 |
| 0.8652777777777777 | 0 |
| 0.8659722222222223 | 0 |
| 0.8666666666666667 | 0 |
| 0.8673611111111111 | 0 |
| 0.8680555555555555 | 0 |
| 0.86875 | 0 |
| 0.8694444444444445 | 0 |
| 0.8701388888888889 | 0 |
| 0.8708333333333332 | 0 |
| 0.8715277777777778 | 0 |
| 0.8722222222222222 | 0 |
| 0.8729166666666667 | 0 |
| 0.873611111111111 | 0 |
| 0.8743055555555556 | 0 |
| 0.875 | 0 |
| 0.8756944444444444 | 0 |
| 0.876388888888889 | 0 |
| 0.8770833333333333 | 0 |
| 0.8777777777777778 | 0 |
| 0.8784722222222222 | 0 |
| 0.8791666666666668 | 0 |
| 0.8798611111111111 | 0 |
| 0.8805555555555555 | 0 |
| 0.88125 | 0 |
| 0.8819444444444445 | 0 |
| 0.8826388888888889 | 0 |
| 0.8833333333333333 | 0 |
| 0.8840277777777777 | 0 |
| 0.8847222222222223 | 0 |
| 0.8854166666666666 | 0 |
| 0.8861111111111111 | 0 |
| 0.8868055555555556 | 0 |
| 0.8875000000000001 | 0 |
| 0.8881944444444444 | 0 |
| 0.8888888888888888 | 0 |
| 0.8895833333333334 | 0 |
| 0.8902777777777778 | 0 |
| 0.8909722222222222 | 0 |
| 0.8916666666666666 | 0 |
| 0.8923611111111112 | 0 |
| 0.8930555555555556 | 0 |
| 0.8937499999999999 | 0 |
| 0.8944444444444444 | 0 |
| 0.8951388888888889 | 0 |
| 0.8958333333333334 | 0 |
| 0.8965277777777777 | 0 |
| 0.8972222222222223 | 0 |
| 0.8979166666666667 | 0 |
| 0.8986111111111111 | 0 |
| 0.8993055555555555 | 0 |
| 0.9 | 0 |
| 0.9006944444444445 | 0 |
| 0.9013888888888889 | 0 |
| 0.9020833333333332 | 0 |
| 0.9027777777777778 | 0 |
| 0.9034722222222222 | 0 |
| 0.9041666666666667 | 0 |
| 0.904861111111111 | 0 |
| 0.9055555555555556 | 0 |
| 0.90625 | 0 |
| 0.9069444444444444 | 0 |
| 0.907638888888889 | 0 |
| 0.9083333333333333 | 0 |
| 0.9090277777777778 | 0 |
| 0.9097222222222222 | 0 |
| 0.9104166666666668 | 0 |
| 0.9111111111111111 | 0 |
| 0.9118055555555555 | 0 |
| 0.9125 | 0 |
| 0.9131944444444445 | 0 |
| 0.9138888888888889 | 0 |
| 0.9145833333333333 | 0 |
| 0.9152777777777777 | 0 |
| 0.9159722222222223 | 0 |
| 0.9166666666666666 | 0 |
| 0.9173611111111111 | 0 |
| 0.9180555555555556 | 0 |
| 0.9187500000000001 | 0 |
| 0.9194444444444444 | 0 |
| 0.9201388888888888 | 0 |
| 0.9208333333333334 | 0 |
| 0.9215277777777778 | 0 |
| 0.9222222222222222 | 0 |
| 0.9229166666666666 | 0 |
| 0.9236111111111112 | 0 |
| 0.9243055555555556 | 0 |
| 0.9249999999999999 | 0 |
| 0.9256944444444444 | 0 |
| 0.9263888888888889 | 0 |
| 0.9270833333333334 | 0 |
| 0.9277777777777777 | 0 |
| 0.9284722222222223 | 0 |
| 0.9291666666666667 | 0 |
| 0.9298611111111111 | 0 |
| 0.9305555555555555 | 0 |
| 0.93125 | 0 |
| 0.9319444444444445 | 0 |
| 0.9326388888888889 | 0 |
| 0.9333333333333332 | 0 |
| 0.9340277777777778 | 0 |
| 0.9347222222222222 | 0 |
| 0.9354166666666667 | 0 |
| 0.936111111111111 | 0 |
| 0.9368055555555556 | 0 |
| 0.9375 | 0 |
| 0.9381944444444444 | 0 |
| 0.938888888888889 | 0 |
| 0.9395833333333333 | 0 |
| 0.9402777777777778 | 0 |
| 0.9409722222222222 | 0 |
| 0.9416666666666668 | 0 |
| 0.9423611111111111 | 0 |
| 0.9430555555555555 | 0 |
| 0.94375 | 0 |
| 0.9444444444444445 | 0 |
| 0.9451388888888889 | 0 |
| 0.9458333333333333 | 0 |
| 0.9465277777777777 | 0 |
| 0.9472222222222223 | 0 |
| 0.9479166666666666 | 0 |
| 0.9486111111111111 | 0 |
| 0.9493055555555556 | 0 |
| 0.9500000000000001 | 0 |
| 0.9506944444444444 | 0 |
| 0.9513888888888888 | 0 |
| 0.9520833333333334 | 0 |
| 0.9527777777777778 | 0 |
| 0.9534722222222222 | 0 |
| 0.9541666666666666 | 0 |
| 0.9548611111111112 | 0 |
| 0.9555555555555556 | 0 |
| 0.9562499999999999 | 0 |
| 0.9569444444444444 | 0 |
| 0.9576388888888889 | 0 |
| 0.9583333333333334 | 0 |
| 0.9590277777777777 | 0 |
| 0.9597222222222223 | 0 |
| 0.9604166666666667 | 0 |
| 0.9611111111111111 | 0 |
| 0.9618055555555555 | 0 |
| 0.9625 | 0 |
| 0.9631944444444445 | 0 |
| 0.9638888888888889 | 0 |
| 0.9645833333333332 | 0 |
| 0.9652777777777778 | 0 |
| 0.9659722222222222 | 0 |
| 0.9666666666666667 | 0 |
| 0.967361111111111 | 0 |
| 0.9680555555555556 | 0 |
| 0.96875 | 0 |
| 0.9694444444444444 | 0 |
| 0.970138888888889 | 0 |
| 0.9708333333333333 | 0 |
| 0.9715277777777778 | 0 |
| 0.9722222222222222 | 0 |
| 0.9729166666666668 | 0 |
| 0.9736111111111111 | 0 |
| 0.9743055555555555 | 0 |
| 0.975 | 0 |
| 0.9756944444444445 | 0 |
| 0.9763888888888889 | 0 |
| 0.9770833333333333 | 0 |
| 0.9777777777777777 | 0 |
| 0.9784722222222223 | 0 |
| 0.9791666666666666 | 0 |
| 0.9798611111111111 | 0 |
| 0.9805555555555556 | 0 |
| 0.9812500000000001 | 0 |
| 0.9819444444444444 | 0 |
| 0.9826388888888888 | 0 |
| 0.9833333333333334 | 0 |
| 0.9840277777777778 | 0 |
| 0.9847222222222222 | 0 |
| 0.9854166666666666 | 0 |
| 0.9861111111111112 | 0 |
| 0.9868055555555556 | 0 |
| 0.9874999999999999 | 0 |
| 0.9881944444444444 | 0 |
| 0.9888888888888889 | 0 |
| 0.9895833333333334 | 0 |
| 0.9902777777777777 | 0 |
| 0.9909722222222223 | 0 |
| 0.9916666666666667 | 0 |
| 0.9923611111111111 | 0 |
| 0.9930555555555555 | 0 |
| 0.99375 | 0 |
| 0.9944444444444445 | 0 |
| 0.9951388888888889 | 0 |
| 0.9958333333333332 | 0 |
| 0.9965277777777778 | 0 |
| 0.9972222222222222 | 0 |
| 0.9979166666666667 | 0 |
| 0.998611111111111 | 0 |
| 0.9993055555555556 | 0 |